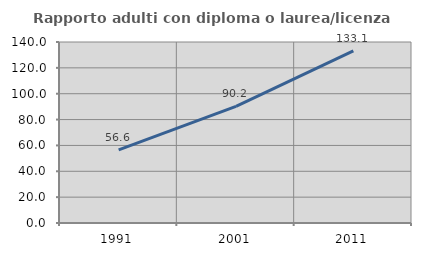
| Category | Rapporto adulti con diploma o laurea/licenza media  |
|---|---|
| 1991.0 | 56.576 |
| 2001.0 | 90.189 |
| 2011.0 | 133.071 |